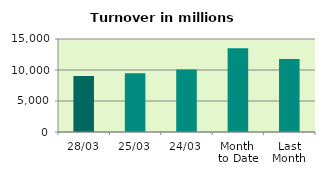
| Category | Series 0 |
|---|---|
| 28/03 | 9033.044 |
| 25/03 | 9465.756 |
| 24/03 | 10089.248 |
| Month 
to Date | 13526.583 |
| Last
Month | 11787.675 |